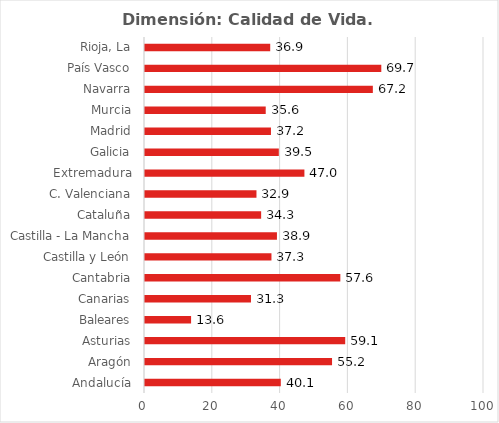
| Category | Dimensión: Calidad de Vida |
|---|---|
| Andalucía | 40.057 |
| Aragón | 55.175 |
| Asturias | 59.059 |
| Baleares | 13.592 |
| Canarias | 31.265 |
| Cantabria | 57.62 |
| Castilla y León | 37.303 |
| Castilla - La Mancha | 38.921 |
| Cataluña | 34.26 |
| C. Valenciana | 32.882 |
| Extremadura | 47.024 |
| Galicia | 39.475 |
| Madrid | 37.156 |
| Murcia | 35.613 |
| Navarra | 67.21 |
| País Vasco | 69.706 |
| Rioja, La | 36.937 |